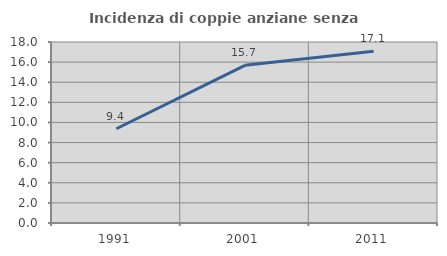
| Category | Incidenza di coppie anziane senza figli  |
|---|---|
| 1991.0 | 9.375 |
| 2001.0 | 15.679 |
| 2011.0 | 17.089 |